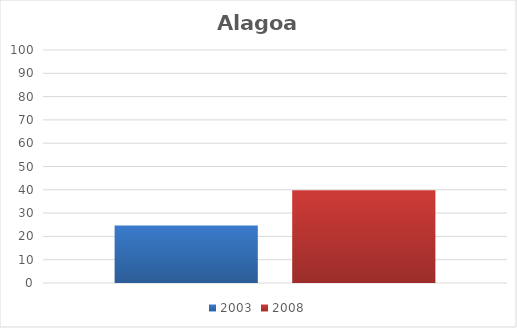
| Category | 2003 | 2008 |
|---|---|---|
| Total | 24.7 | 39.8 |